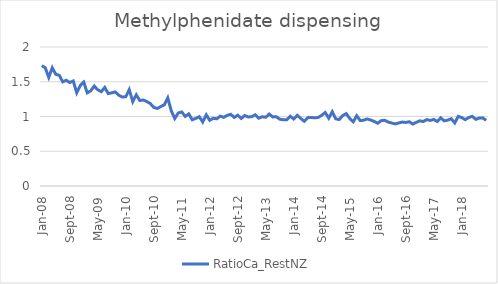
| Category | RatioCa_RestNZ |
|---|---|
| 2008-01-01 | 1.732 |
| 2008-02-01 | 1.702 |
| 2008-03-01 | 1.563 |
| 2008-04-01 | 1.701 |
| 2008-05-01 | 1.607 |
| 2008-06-01 | 1.593 |
| 2008-07-01 | 1.498 |
| 2008-08-01 | 1.521 |
| 2008-09-01 | 1.489 |
| 2008-10-01 | 1.512 |
| 2008-11-01 | 1.341 |
| 2008-12-01 | 1.445 |
| 2009-01-01 | 1.495 |
| 2009-02-01 | 1.34 |
| 2009-03-01 | 1.37 |
| 2009-04-01 | 1.438 |
| 2009-05-01 | 1.385 |
| 2009-06-01 | 1.357 |
| 2009-07-01 | 1.418 |
| 2009-08-01 | 1.329 |
| 2009-09-01 | 1.341 |
| 2009-10-01 | 1.354 |
| 2009-11-01 | 1.306 |
| 2009-12-01 | 1.281 |
| 2010-01-01 | 1.284 |
| 2010-02-01 | 1.385 |
| 2010-03-01 | 1.214 |
| 2010-04-01 | 1.313 |
| 2010-05-01 | 1.23 |
| 2010-06-01 | 1.237 |
| 2010-07-01 | 1.216 |
| 2010-08-01 | 1.187 |
| 2010-09-01 | 1.131 |
| 2010-10-01 | 1.116 |
| 2010-11-01 | 1.142 |
| 2010-12-01 | 1.168 |
| 2011-01-01 | 1.268 |
| 2011-02-01 | 1.083 |
| 2011-03-01 | 0.971 |
| 2011-04-01 | 1.05 |
| 2011-05-01 | 1.065 |
| 2011-06-01 | 1.001 |
| 2011-07-01 | 1.038 |
| 2011-08-01 | 0.953 |
| 2011-09-01 | 0.973 |
| 2011-10-01 | 0.998 |
| 2011-11-01 | 0.921 |
| 2011-12-01 | 1.024 |
| 2012-01-01 | 0.945 |
| 2012-02-01 | 0.975 |
| 2012-03-01 | 0.967 |
| 2012-04-01 | 1.006 |
| 2012-05-01 | 0.988 |
| 2012-06-01 | 1.017 |
| 2012-07-01 | 1.032 |
| 2012-08-01 | 0.987 |
| 2012-09-01 | 1.019 |
| 2012-10-01 | 0.972 |
| 2012-11-01 | 1.015 |
| 2012-12-01 | 0.993 |
| 2013-01-01 | 0.997 |
| 2013-02-01 | 1.026 |
| 2013-03-01 | 0.975 |
| 2013-04-01 | 0.996 |
| 2013-05-01 | 0.989 |
| 2013-06-01 | 1.035 |
| 2013-07-01 | 0.993 |
| 2013-08-01 | 0.998 |
| 2013-09-01 | 0.962 |
| 2013-10-01 | 0.953 |
| 2013-11-01 | 0.953 |
| 2013-12-01 | 1.004 |
| 2014-01-01 | 0.964 |
| 2014-02-01 | 1.017 |
| 2014-03-01 | 0.973 |
| 2014-04-01 | 0.931 |
| 2014-05-01 | 0.983 |
| 2014-06-01 | 0.986 |
| 2014-07-01 | 0.981 |
| 2014-08-01 | 0.986 |
| 2014-09-01 | 1.018 |
| 2014-10-01 | 1.058 |
| 2014-11-01 | 0.976 |
| 2014-12-01 | 1.069 |
| 2015-01-01 | 0.966 |
| 2015-02-01 | 0.956 |
| 2015-03-01 | 1.014 |
| 2015-04-01 | 1.041 |
| 2015-05-01 | 0.97 |
| 2015-06-01 | 0.923 |
| 2015-07-01 | 1.011 |
| 2015-08-01 | 0.941 |
| 2015-09-01 | 0.947 |
| 2015-10-01 | 0.964 |
| 2015-11-01 | 0.949 |
| 2015-12-01 | 0.929 |
| 2016-01-01 | 0.903 |
| 2016-02-01 | 0.94 |
| 2016-03-01 | 0.946 |
| 2016-04-01 | 0.92 |
| 2016-05-01 | 0.906 |
| 2016-06-01 | 0.894 |
| 2016-07-01 | 0.907 |
| 2016-08-01 | 0.92 |
| 2016-09-01 | 0.914 |
| 2016-10-01 | 0.925 |
| 2016-11-01 | 0.891 |
| 2016-12-01 | 0.915 |
| 2017-01-01 | 0.938 |
| 2017-02-01 | 0.927 |
| 2017-03-01 | 0.956 |
| 2017-04-01 | 0.943 |
| 2017-05-01 | 0.958 |
| 2017-06-01 | 0.928 |
| 2017-07-01 | 0.981 |
| 2017-08-01 | 0.937 |
| 2017-09-01 | 0.948 |
| 2017-10-01 | 0.968 |
| 2017-11-01 | 0.908 |
| 2017-12-01 | 1.002 |
| 2018-01-01 | 0.984 |
| 2018-02-01 | 0.954 |
| 2018-03-01 | 0.985 |
| 2018-04-01 | 1.003 |
| 2018-05-01 | 0.959 |
| 2018-06-01 | 0.978 |
| 2018-07-01 | 0.978 |
| 2018-08-01 | 0.945 |